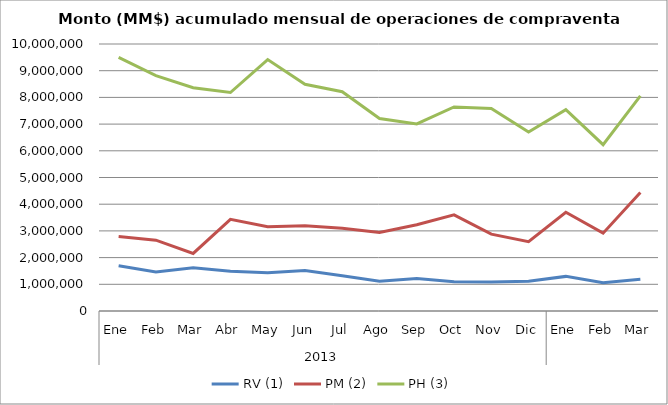
| Category | RV (1) | PM (2) | PH (3) |
|---|---|---|---|
| 0 | 1693090.019 | 2788692.01 | 9495719.157 |
| 1 | 1457870.523 | 2652319.476 | 8814454.346 |
| 2 | 1619570.46 | 2155113.626 | 8361658.957 |
| 3 | 1485677.791 | 3434435.881 | 8182321.991 |
| 4 | 1434943.507 | 3155786.06 | 9417818.094 |
| 5 | 1516566.545 | 3191285.457 | 8490151.421 |
| 6 | 1322115.523 | 3099755.507 | 8212010.547 |
| 7 | 1118245.895 | 2937089.197 | 7211658.784 |
| 8 | 1215047.725 | 3232334.418 | 7008526.172 |
| 9 | 1092035.083 | 3603082.09 | 7640993.748 |
| 10 | 1088055.605 | 2879188.198 | 7583918.365 |
| 11 | 1114851.326 | 2596986.123 | 6700659.979 |
| 12 | 1296256.43 | 3700290.091 | 7538361.261 |
| 13 | 1061199.219 | 2915830.381 | 6230064.605 |
| 14 | 1189463.212 | 4440910.02 | 8058380.739 |